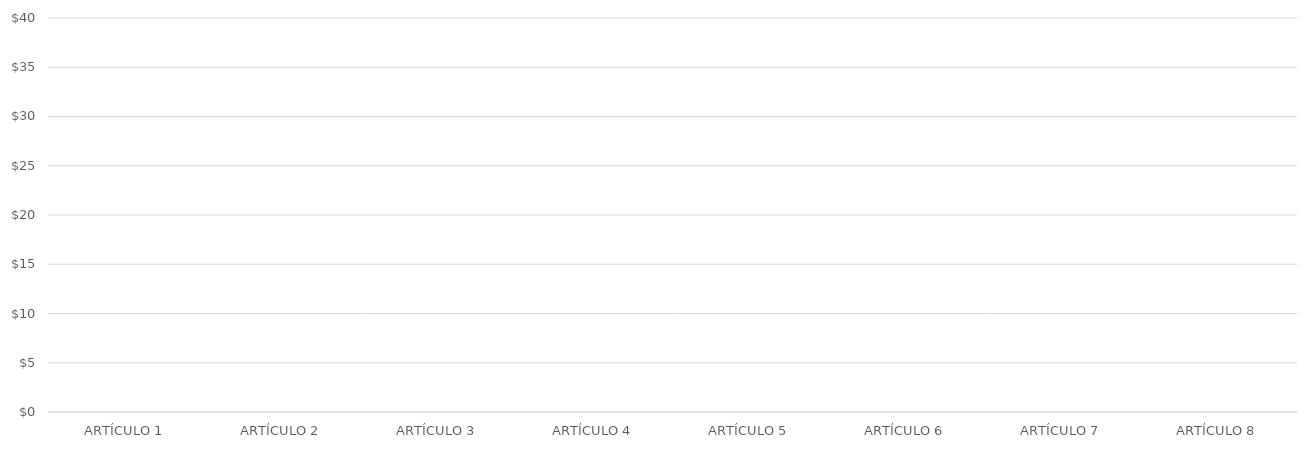
| Category | GANANCIA POR ARTÍCULO |
|---|---|
| ARTÍCULO 1 | 0 |
| ARTÍCULO 2 | 0 |
| ARTÍCULO 3 | 0 |
| ARTÍCULO 4 | 0 |
| ARTÍCULO 5 | 0 |
| ARTÍCULO 6 | 0 |
| ARTÍCULO 7 | 0 |
| ARTÍCULO 8 | 0 |